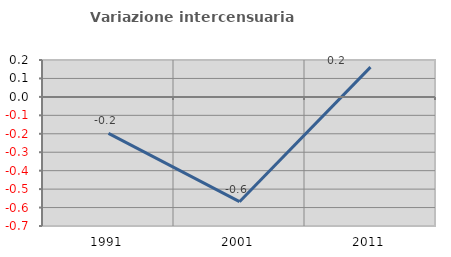
| Category | Variazione intercensuaria annua |
|---|---|
| 1991.0 | -0.198 |
| 2001.0 | -0.568 |
| 2011.0 | 0.162 |